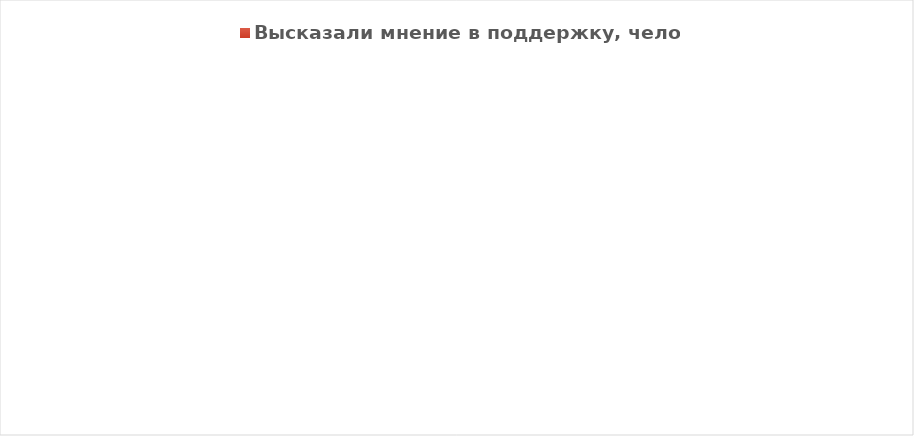
| Category | Высказали мнение в поддержку, человек |
|---|---|
| Благоустройство Парковой зоны в цетре с ела Александровка "Крыло ласточки" | 77 |
| Устройство пешеходного тротуара с.Александровка (600 метров) | 13 |
| Спортивные плоскостные сооружения "Остров мечты" | 2 |
| Ваши предложения | 0 |
| Всего опрошено, человек | 92 |